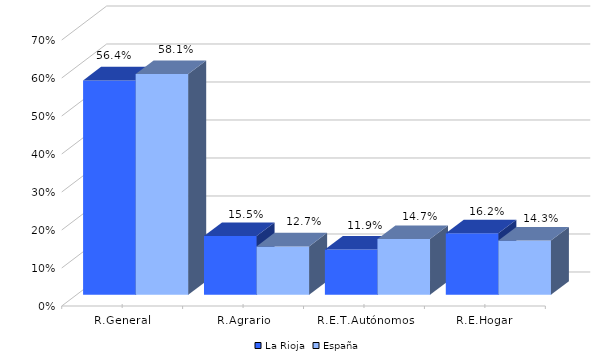
| Category | La Rioja | España |
|---|---|---|
| R.General | 0.564 | 0.581 |
| R.Agrario | 0.155 | 0.127 |
| R.E.T.Autónomos | 0.119 | 0.147 |
| R.E.Hogar | 0.162 | 0.143 |